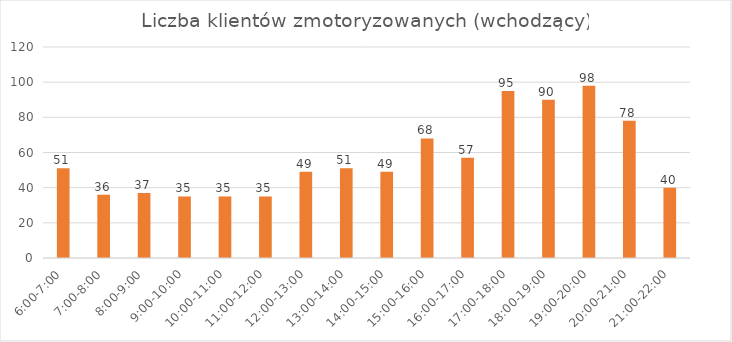
| Category | os/godz |
|---|---|
| 6:00-7:00 | 51 |
| 7:00-8:00 | 36 |
| 8:00-9:00 | 37 |
| 9:00-10:00 | 35 |
| 10:00-11:00 | 35 |
| 11:00-12:00 | 35 |
| 12:00-13:00 | 49 |
| 13:00-14:00 | 51 |
| 14:00-15:00 | 49 |
| 15:00-16:00 | 68 |
| 16:00-17:00 | 57 |
| 17:00-18:00 | 95 |
| 18:00-19:00 | 90 |
| 19:00-20:00 | 98 |
| 20:00-21:00 | 78 |
| 21:00-22:00 | 40 |